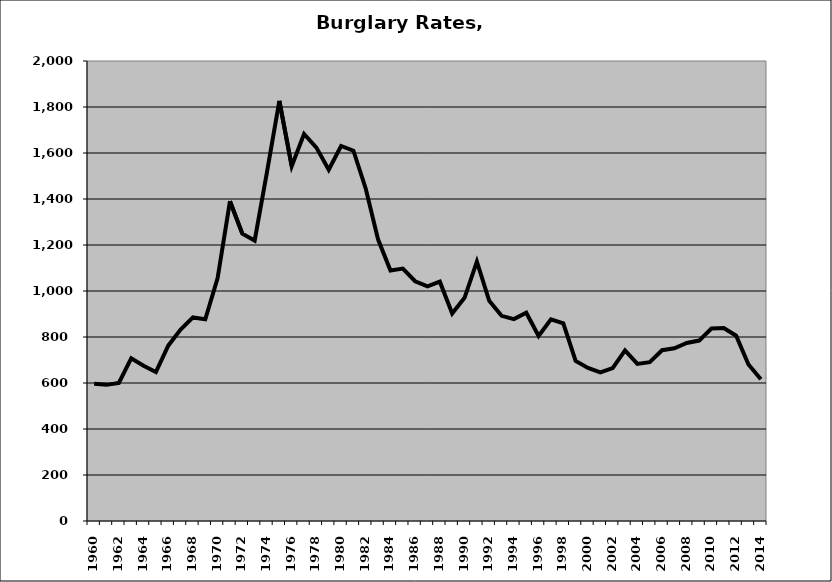
| Category | Burglary |
|---|---|
| 1960.0 | 596.246 |
| 1961.0 | 591.921 |
| 1962.0 | 600 |
| 1963.0 | 707.143 |
| 1964.0 | 674.745 |
| 1965.0 | 647.921 |
| 1966.0 | 762.305 |
| 1967.0 | 832.061 |
| 1968.0 | 885.019 |
| 1969.0 | 877.222 |
| 1970.0 | 1056.186 |
| 1971.0 | 1390.502 |
| 1972.0 | 1249.381 |
| 1973.0 | 1219.444 |
| 1974.0 | 1517.801 |
| 1975.0 | 1826.252 |
| 1976.0 | 1542.612 |
| 1977.0 | 1682.646 |
| 1978.0 | 1623.671 |
| 1979.0 | 1527.491 |
| 1980.0 | 1630.522 |
| 1981.0 | 1609.866 |
| 1982.0 | 1444.85 |
| 1983.0 | 1223.432 |
| 1984.0 | 1089.396 |
| 1985.0 | 1097.428 |
| 1986.0 | 1042.338 |
| 1987.0 | 1020.497 |
| 1988.0 | 1040.606 |
| 1989.0 | 902.229 |
| 1990.0 | 970.476 |
| 1991.0 | 1127.647 |
| 1992.0 | 957.62 |
| 1993.0 | 892 |
| 1994.0 | 877.904 |
| 1995.0 | 905.3 |
| 1996.0 | 804.138 |
| 1997.0 | 877.186 |
| 1998.0 | 859.543 |
| 1999.0 | 696.05 |
| 2000.0 | 665.646 |
| 2001.0 | 645.745 |
| 2002.0 | 664.437 |
| 2003.0 | 741.414 |
| 2004.0 | 682.955 |
| 2005.0 | 690.355 |
| 2006.0 | 742.493 |
| 2007.0 | 751.188 |
| 2008.0 | 774.129 |
| 2009.0 | 784.412 |
| 2010.0 | 836.921 |
| 2011.0 | 838.75 |
| 2012.0 | 805.733 |
| 2013.0 | 680.796 |
| 2014.0 | 616.494 |